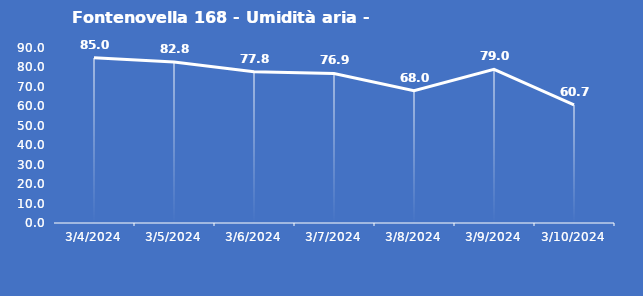
| Category | Fontenovella 168 - Umidità aria - Grezzo (%) |
|---|---|
| 3/4/24 | 85 |
| 3/5/24 | 82.8 |
| 3/6/24 | 77.8 |
| 3/7/24 | 76.9 |
| 3/8/24 | 68 |
| 3/9/24 | 79 |
| 3/10/24 | 60.7 |